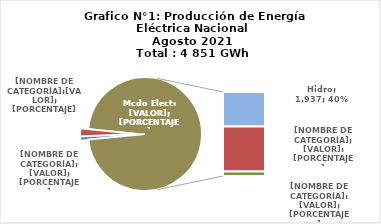
| Category | Series 0 |
|---|---|
| 0 | 42.736 |
| 1 | 109.892 |
| 2 | 1936.536 |
| 3 | 2511.374 |
| 4 | 250.152 |